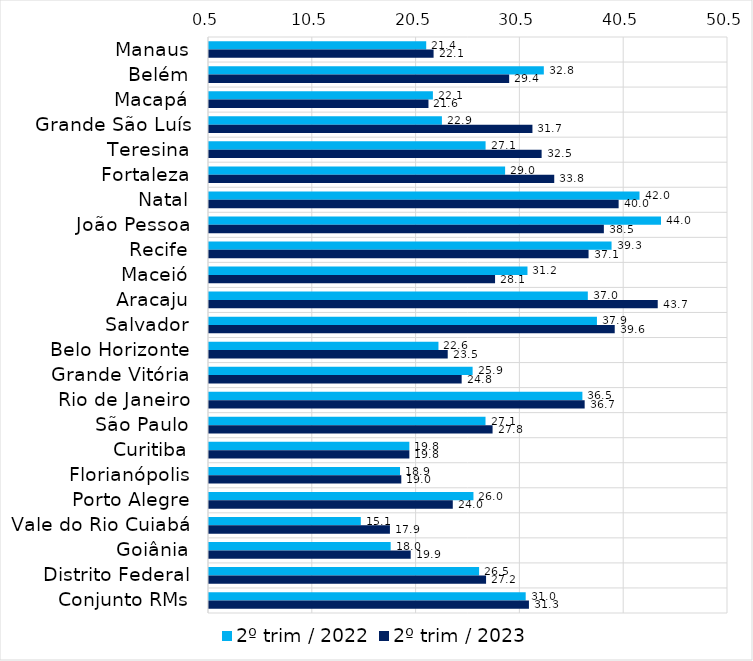
| Category | 2º trim / 2022 | 2º trim / 2023 |
|---|---|---|
| Manaus | 21.427 | 22.136 |
| Belém | 32.756 | 29.418 |
| Macapá | 22.071 | 21.643 |
| Grande São Luís | 22.938 | 31.66 |
| Teresina | 27.146 | 32.545 |
| Fortaleza | 29.027 | 33.76 |
| Natal | 41.974 | 39.964 |
| João Pessoa | 44.046 | 38.541 |
| Recife | 39.282 | 37.067 |
| Maceió | 31.182 | 28.059 |
| Aracaju | 36.995 | 43.73 |
| Salvador | 37.874 | 39.587 |
| Belo Horizonte | 22.606 | 23.499 |
| Grande Vitória | 25.896 | 24.841 |
| Rio de Janeiro | 36.473 | 36.692 |
| São Paulo | 27.139 | 27.819 |
| Curitiba | 19.801 | 19.802 |
| Florianópolis | 18.904 | 19.026 |
| Porto Alegre | 25.977 | 23.986 |
| Vale do Rio Cuiabá | 15.125 | 17.93 |
| Goiânia | 18.002 | 19.933 |
| Distrito Federal | 26.521 | 27.192 |
| Conjunto RMs | 31.01 | 31.324 |